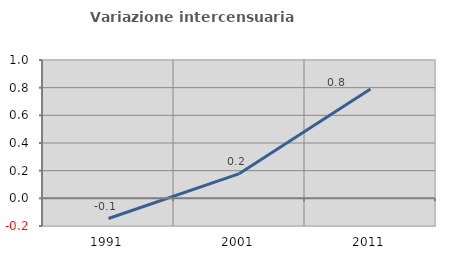
| Category | Variazione intercensuaria annua |
|---|---|
| 1991.0 | -0.146 |
| 2001.0 | 0.179 |
| 2011.0 | 0.79 |